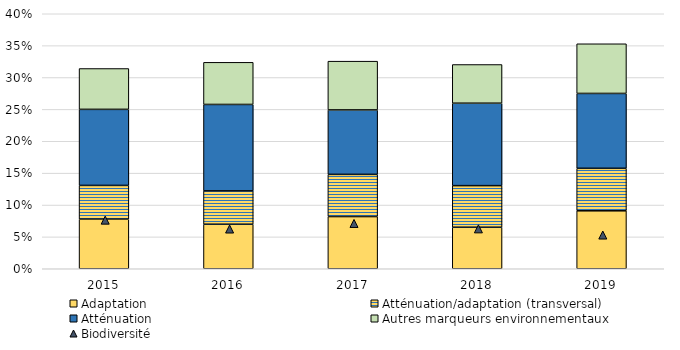
| Category | Adaptation | Atténuation/adaptation (transversal) | Atténuation | Autres marqueurs environnementaux |
|---|---|---|---|---|
| 2015.0 | 0.078 | 0.053 | 0.119 | 0.064 |
| 2016.0 | 0.07 | 0.052 | 0.136 | 0.066 |
| 2017.0 | 0.082 | 0.066 | 0.101 | 0.076 |
| 2018.0 | 0.065 | 0.065 | 0.129 | 0.061 |
| 2019.0 | 0.091 | 0.067 | 0.117 | 0.078 |